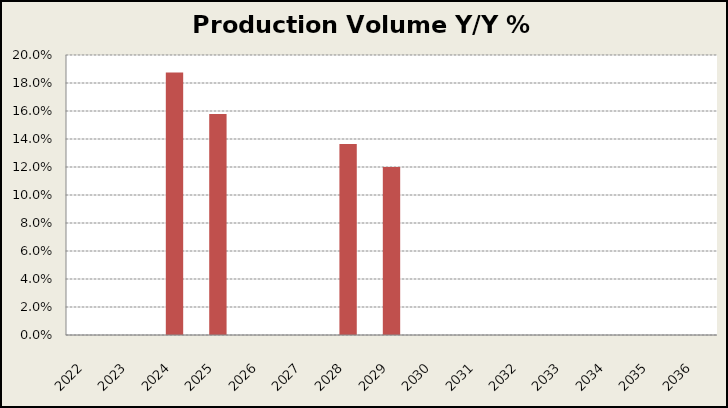
| Category | Y/Y % Change |
|---|---|
| 2022.0 | 0 |
| 2023.0 | 0 |
| 2024.0 | 0.188 |
| 2025.0 | 0.158 |
| 2026.0 | 0 |
| 2027.0 | 0 |
| 2028.0 | 0.136 |
| 2029.0 | 0.12 |
| 2030.0 | 0 |
| 2031.0 | 0 |
| 2032.0 | 0 |
| 2033.0 | 0 |
| 2034.0 | 0 |
| 2035.0 | 0 |
| 2036.0 | 0 |